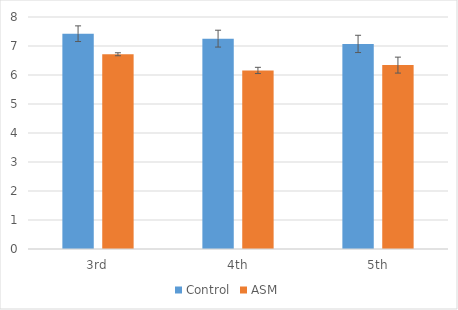
| Category | Control | ASM |
|---|---|---|
| 3rd | 7.424 | 6.715 |
| 4th | 7.254 | 6.157 |
| 5th | 7.072 | 6.341 |